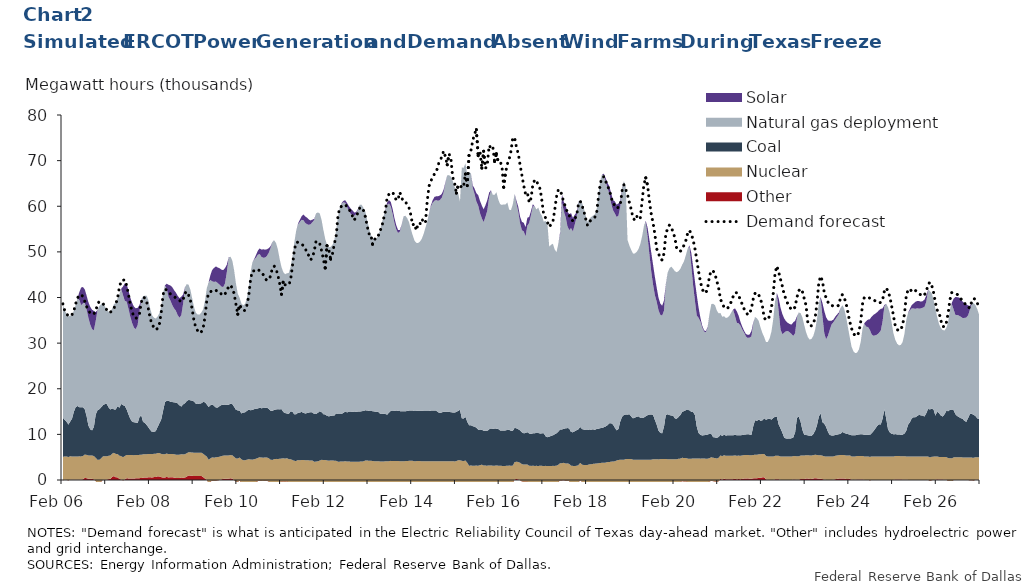
| Category | Demand forecast |
|---|---|
| 2021-02-06 | 38.603 |
| 2021-02-06 01:00:00 | 37.098 |
| 2021-02-06 01:59:59 | 36.406 |
| 2021-02-06 02:59:59 | 35.972 |
| 2021-02-06 03:59:59 | 35.879 |
| 2021-02-06 04:59:59 | 36.238 |
| 2021-02-06 05:59:59 | 37.058 |
| 2021-02-06 06:59:59 | 38.604 |
| 2021-02-06 07:59:59 | 39.868 |
| 2021-02-06 08:59:59 | 40.562 |
| 2021-02-06 09:59:59 | 40.577 |
| 2021-02-06 10:59:59 | 40.236 |
| 2021-02-06 11:59:59 | 39.157 |
| 2021-02-06 12:59:59 | 38.033 |
| 2021-02-06 13:59:59 | 37.12 |
| 2021-02-06 14:59:59 | 36.607 |
| 2021-02-06 15:59:59 | 36.265 |
| 2021-02-06 16:59:59 | 36.418 |
| 2021-02-06 17:59:59 | 36.966 |
| 2021-02-06 18:59:59 | 38.603 |
| 2021-02-06 19:59:59 | 39.125 |
| 2021-02-06 20:59:59 | 38.965 |
| 2021-02-06 21:59:59 | 38.671 |
| 2021-02-06 22:59:59 | 38.06 |
| 2021-02-06 23:59:59 | 37.316 |
| 2021-02-07 00:59:59 | 36.725 |
| 2021-02-07 01:59:59 | 36.808 |
| 2021-02-07 02:59:59 | 36.994 |
| 2021-02-07 03:59:59 | 37.567 |
| 2021-02-07 04:59:59 | 38.61 |
| 2021-02-07 05:59:59 | 39.798 |
| 2021-02-07 06:59:59 | 42.202 |
| 2021-02-07 07:59:59 | 43.675 |
| 2021-02-07 08:59:59 | 43.78 |
| 2021-02-07 09:59:59 | 43.868 |
| 2021-02-07 10:59:59 | 42.668 |
| 2021-02-07 11:59:59 | 40.676 |
| 2021-02-07 12:59:59 | 38.45 |
| 2021-02-07 13:59:59 | 36.906 |
| 2021-02-07 14:59:59 | 35.811 |
| 2021-02-07 15:59:59 | 35.426 |
| 2021-02-07 16:59:59 | 35.669 |
| 2021-02-07 17:59:59 | 36.302 |
| 2021-02-07 18:59:59 | 38.915 |
| 2021-02-07 19:59:59 | 40.088 |
| 2021-02-07 20:59:59 | 39.893 |
| 2021-02-07 21:59:59 | 39.015 |
| 2021-02-07 22:59:59 | 37.355 |
| 2021-02-07 23:59:59 | 35.226 |
| 2021-02-08 00:59:59 | 34.246 |
| 2021-02-08 01:59:59 | 33.296 |
| 2021-02-08 02:59:59 | 32.929 |
| 2021-02-08 03:59:59 | 33.219 |
| 2021-02-08 04:59:59 | 34.242 |
| 2021-02-08 05:59:59 | 36.758 |
| 2021-02-08 06:59:59 | 40.654 |
| 2021-02-08 07:59:59 | 41.841 |
| 2021-02-08 08:59:59 | 41.646 |
| 2021-02-08 09:59:59 | 41.359 |
| 2021-02-08 10:59:59 | 40.795 |
| 2021-02-08 11:59:59 | 40.624 |
| 2021-02-08 12:59:59 | 40.278 |
| 2021-02-08 13:59:59 | 39.857 |
| 2021-02-08 14:59:59 | 39.524 |
| 2021-02-08 15:59:59 | 39.342 |
| 2021-02-08 16:59:59 | 39.048 |
| 2021-02-08 17:59:59 | 39.533 |
| 2021-02-08 18:59:59 | 40.945 |
| 2021-02-08 19:59:59 | 41.309 |
| 2021-02-08 20:59:59 | 40.535 |
| 2021-02-08 21:59:59 | 39.327 |
| 2021-02-08 22:59:59 | 37.386 |
| 2021-02-08 23:59:59 | 34.805 |
| 2021-02-09 00:59:59 | 33.389 |
| 2021-02-09 01:59:59 | 32.707 |
| 2021-02-09 02:59:59 | 32.187 |
| 2021-02-09 03:59:59 | 32.464 |
| 2021-02-09 04:59:59 | 33.324 |
| 2021-02-09 05:59:59 | 35.757 |
| 2021-02-09 06:59:59 | 39.396 |
| 2021-02-09 07:59:59 | 40.957 |
| 2021-02-09 08:59:59 | 41.263 |
| 2021-02-09 09:59:59 | 41.497 |
| 2021-02-09 10:59:59 | 41.384 |
| 2021-02-09 11:59:59 | 41.592 |
| 2021-02-09 12:59:59 | 41.244 |
| 2021-02-09 13:59:59 | 41.213 |
| 2021-02-09 14:59:59 | 40.725 |
| 2021-02-09 15:59:59 | 41.131 |
| 2021-02-09 16:59:59 | 40.81 |
| 2021-02-09 17:59:59 | 41.366 |
| 2021-02-09 18:59:59 | 42.464 |
| 2021-02-09 19:59:59 | 42.71 |
| 2021-02-09 20:59:59 | 42.051 |
| 2021-02-09 21:59:59 | 40.849 |
| 2021-02-09 22:59:59 | 38.527 |
| 2021-02-09 23:59:59 | 36.346 |
| 2021-02-10 00:59:59 | 38.45 |
| 2021-02-10 01:59:59 | 37.625 |
| 2021-02-10 02:59:59 | 37.133 |
| 2021-02-10 04:00:00 | 37.165 |
| 2021-02-10 05:00:00 | 38.248 |
| 2021-02-10 06:00:00 | 40.311 |
| 2021-02-10 07:00:00 | 43.892 |
| 2021-02-10 07:59:59 | 45.817 |
| 2021-02-10 08:59:59 | 45.833 |
| 2021-02-10 09:59:59 | 46.128 |
| 2021-02-10 10:59:59 | 46.184 |
| 2021-02-10 11:59:59 | 45.853 |
| 2021-02-10 12:59:59 | 45.424 |
| 2021-02-10 13:59:59 | 45.005 |
| 2021-02-10 14:59:59 | 44.129 |
| 2021-02-10 15:59:59 | 43.757 |
| 2021-02-10 16:59:59 | 43.932 |
| 2021-02-10 17:59:59 | 44.703 |
| 2021-02-10 18:59:59 | 46.479 |
| 2021-02-10 19:59:59 | 46.879 |
| 2021-02-10 20:59:59 | 46.223 |
| 2021-02-10 21:59:59 | 44.92 |
| 2021-02-10 22:59:59 | 43.029 |
| 2021-02-10 23:59:59 | 40.713 |
| 2021-02-11 00:59:59 | 43.672 |
| 2021-02-11 01:59:59 | 42.783 |
| 2021-02-11 02:59:59 | 42.731 |
| 2021-02-11 03:59:59 | 42.745 |
| 2021-02-11 04:59:59 | 43.816 |
| 2021-02-11 05:59:59 | 46.855 |
| 2021-02-11 06:59:59 | 50.215 |
| 2021-02-11 07:59:59 | 52.038 |
| 2021-02-11 08:59:59 | 52.116 |
| 2021-02-11 09:59:59 | 51.917 |
| 2021-02-11 10:59:59 | 51.627 |
| 2021-02-11 11:59:59 | 51.421 |
| 2021-02-11 12:59:59 | 50.925 |
| 2021-02-11 13:59:59 | 49.542 |
| 2021-02-11 14:59:59 | 49.243 |
| 2021-02-11 15:59:59 | 48.256 |
| 2021-02-11 16:59:59 | 48.76 |
| 2021-02-11 17:59:59 | 50.23 |
| 2021-02-11 18:59:59 | 52.381 |
| 2021-02-11 19:59:59 | 52.111 |
| 2021-02-11 20:59:59 | 51.777 |
| 2021-02-11 21:59:59 | 50.307 |
| 2021-02-11 22:59:59 | 48.479 |
| 2021-02-11 23:59:59 | 46.472 |
| 2021-02-12 00:59:59 | 51.355 |
| 2021-02-12 01:59:59 | 50.433 |
| 2021-02-12 02:59:59 | 48.415 |
| 2021-02-12 03:59:59 | 49.612 |
| 2021-02-12 04:59:59 | 51.692 |
| 2021-02-12 05:59:59 | 53.404 |
| 2021-02-12 06:59:59 | 57.809 |
| 2021-02-12 07:59:59 | 59.736 |
| 2021-02-12 08:59:59 | 59.983 |
| 2021-02-12 09:59:59 | 60.101 |
| 2021-02-12 10:59:59 | 60.375 |
| 2021-02-12 11:59:59 | 59.888 |
| 2021-02-12 12:59:59 | 59.519 |
| 2021-02-12 13:59:59 | 58.607 |
| 2021-02-12 14:59:59 | 57.837 |
| 2021-02-12 15:59:59 | 56.924 |
| 2021-02-12 16:59:59 | 57.958 |
| 2021-02-12 17:59:59 | 58.52 |
| 2021-02-12 18:59:59 | 59.72 |
| 2021-02-12 19:59:59 | 59.688 |
| 2021-02-12 20:59:59 | 59.098 |
| 2021-02-12 21:59:59 | 57.764 |
| 2021-02-12 22:59:59 | 55.817 |
| 2021-02-12 23:59:59 | 53.951 |
| 2021-02-13 00:59:59 | 53.966 |
| 2021-02-13 01:59:59 | 51.704 |
| 2021-02-13 02:59:59 | 52.83 |
| 2021-02-13 03:59:59 | 52.772 |
| 2021-02-13 04:59:59 | 53.308 |
| 2021-02-13 05:59:59 | 54.625 |
| 2021-02-13 06:59:59 | 55.275 |
| 2021-02-13 07:59:59 | 57.183 |
| 2021-02-13 08:59:59 | 58.775 |
| 2021-02-13 09:59:59 | 61.933 |
| 2021-02-13 10:59:59 | 62.619 |
| 2021-02-13 11:59:59 | 63.01 |
| 2021-02-13 12:59:59 | 63.043 |
| 2021-02-13 13:59:59 | 62.408 |
| 2021-02-13 14:59:59 | 61.28 |
| 2021-02-13 15:59:59 | 61.567 |
| 2021-02-13 16:59:59 | 63.06 |
| 2021-02-13 17:59:59 | 61.745 |
| 2021-02-13 18:59:59 | 61.207 |
| 2021-02-13 19:59:59 | 61.143 |
| 2021-02-13 20:59:59 | 60.248 |
| 2021-02-13 21:59:59 | 59.706 |
| 2021-02-13 22:59:59 | 58.134 |
| 2021-02-13 23:59:59 | 55.882 |
| 2021-02-14 00:59:59 | 56.179 |
| 2021-02-14 01:59:59 | 54.689 |
| 2021-02-14 02:59:59 | 56.145 |
| 2021-02-14 03:59:59 | 56.032 |
| 2021-02-14 04:59:59 | 57.194 |
| 2021-02-14 05:59:59 | 56.63 |
| 2021-02-14 06:59:59 | 56.283 |
| 2021-02-14 07:59:59 | 61.088 |
| 2021-02-14 08:59:59 | 64.387 |
| 2021-02-14 10:00:00 | 65.501 |
| 2021-02-14 11:00:00 | 66.395 |
| 2021-02-14 12:00:00 | 67.082 |
| 2021-02-14 12:59:59 | 67.471 |
| 2021-02-14 14:00:00 | 69.088 |
| 2021-02-14 15:00:00 | 70.007 |
| 2021-02-14 16:00:00 | 70.795 |
| 2021-02-14 17:00:00 | 72.101 |
| 2021-02-14 18:00:00 | 70.872 |
| 2021-02-14 19:00:00 | 69.094 |
| 2021-02-14 20:00:00 | 71.491 |
| 2021-02-14 21:00:00 | 70.522 |
| 2021-02-14 22:00:00 | 66.375 |
| 2021-02-14 23:00:00 | 65.166 |
| 2021-02-15 | 62.892 |
| 2021-02-15 01:00:00 | 64.579 |
| 2021-02-15 02:00:00 | 64.731 |
| 2021-02-15 03:00:00 | 64.015 |
| 2021-02-15 04:00:00 | 64.45 |
| 2021-02-15 05:00:00 | 67.069 |
| 2021-02-15 06:00:00 | 64.516 |
| 2021-02-15 07:00:00 | 71.408 |
| 2021-02-15 08:00:00 | 72.183 |
| 2021-02-15 09:00:00 | 74.356 |
| 2021-02-15 10:00:00 | 75.857 |
| 2021-02-15 11:00:00 | 76.783 |
| 2021-02-15 12:00:00 | 71.092 |
| 2021-02-15 13:00:00 | 71.972 |
| 2021-02-15 14:00:00 | 68.364 |
| 2021-02-15 15:00:00 | 72.062 |
| 2021-02-15 16:00:00 | 68.281 |
| 2021-02-15 17:00:00 | 69.139 |
| 2021-02-15 18:00:00 | 73.309 |
| 2021-02-15 19:00:00 | 72.78 |
| 2021-02-15 20:00:00 | 73.149 |
| 2021-02-15 21:00:00 | 69.814 |
| 2021-02-15 22:00:00 | 71.515 |
| 2021-02-15 23:00:00 | 69.706 |
| 2021-02-16 | 69.759 |
| 2021-02-16 01:00:00 | 68.946 |
| 2021-02-16 02:00:00 | 64.179 |
| 2021-02-16 03:00:00 | 67.283 |
| 2021-02-16 04:00:00 | 69.263 |
| 2021-02-16 05:00:00 | 70.318 |
| 2021-02-16 06:00:00 | 72.111 |
| 2021-02-16 07:00:00 | 75.061 |
| 2021-02-16 08:00:00 | 74.994 |
| 2021-02-16 09:00:00 | 72.937 |
| 2021-02-16 10:00:00 | 71.521 |
| 2021-02-16 11:00:00 | 69.033 |
| 2021-02-16 12:00:00 | 66.806 |
| 2021-02-16 13:00:00 | 64.56 |
| 2021-02-16 14:00:00 | 62.636 |
| 2021-02-16 15:00:00 | 62.981 |
| 2021-02-16 16:00:00 | 60.778 |
| 2021-02-16 17:00:00 | 61.726 |
| 2021-02-16 18:00:00 | 64.736 |
| 2021-02-16 19:00:00 | 65.722 |
| 2021-02-16 20:00:00 | 65.754 |
| 2021-02-16 21:00:00 | 64.426 |
| 2021-02-16 22:00:00 | 63.834 |
| 2021-02-16 23:00:00 | 61.165 |
| 2021-02-17 | 57.985 |
| 2021-02-17 01:00:00 | 57.474 |
| 2021-02-17 02:00:00 | 56.535 |
| 2021-02-17 03:00:00 | 55.462 |
| 2021-02-17 04:00:00 | 56.034 |
| 2021-02-17 05:00:00 | 56.549 |
| 2021-02-17 06:00:00 | 59.162 |
| 2021-02-17 07:00:00 | 62.111 |
| 2021-02-17 08:00:00 | 63.603 |
| 2021-02-17 09:00:00 | 63.545 |
| 2021-02-17 10:00:00 | 62.403 |
| 2021-02-17 11:00:00 | 60.8 |
| 2021-02-17 12:00:00 | 59.86 |
| 2021-02-17 13:00:00 | 58.533 |
| 2021-02-17 14:00:00 | 57.908 |
| 2021-02-17 15:00:00 | 57.707 |
| 2021-02-17 16:00:00 | 56.626 |
| 2021-02-17 17:00:00 | 57.321 |
| 2021-02-17 18:00:00 | 57.875 |
| 2021-02-17 19:00:00 | 60.349 |
| 2021-02-17 20:00:00 | 61.131 |
| 2021-02-17 21:00:00 | 60.223 |
| 2021-02-17 22:00:00 | 58.924 |
| 2021-02-17 23:00:00 | 57.279 |
| 2021-02-18 | 55.798 |
| 2021-02-18 01:00:00 | 56.591 |
| 2021-02-18 02:00:00 | 56.97 |
| 2021-02-18 03:00:00 | 57.292 |
| 2021-02-18 04:00:00 | 57.549 |
| 2021-02-18 05:00:00 | 58.466 |
| 2021-02-18 06:00:00 | 61.974 |
| 2021-02-18 07:00:00 | 64.912 |
| 2021-02-18 08:00:00 | 66.327 |
| 2021-02-18 09:00:00 | 66.471 |
| 2021-02-18 10:00:00 | 65.485 |
| 2021-02-18 11:00:00 | 64.457 |
| 2021-02-18 12:00:00 | 63.585 |
| 2021-02-18 13:00:00 | 62.053 |
| 2021-02-18 14:00:00 | 60.557 |
| 2021-02-18 15:00:00 | 60.25 |
| 2021-02-18 16:00:00 | 59.555 |
| 2021-02-18 17:00:00 | 59.783 |
| 2021-02-18 18:00:00 | 60.335 |
| 2021-02-18 19:00:00 | 63.393 |
| 2021-02-18 20:00:00 | 64.703 |
| 2021-02-18 21:00:00 | 63.696 |
| 2021-02-18 22:00:00 | 62.502 |
| 2021-02-18 23:00:00 | 60.798 |
| 2021-02-19 | 59.303 |
| 2021-02-19 01:00:00 | 57.383 |
| 2021-02-19 02:00:00 | 56.968 |
| 2021-02-19 03:00:00 | 57.85 |
| 2021-02-19 04:00:00 | 57.092 |
| 2021-02-19 05:00:00 | 57.468 |
| 2021-02-19 06:00:00 | 61.188 |
| 2021-02-19 07:00:00 | 64.821 |
| 2021-02-19 08:00:00 | 66.218 |
| 2021-02-19 09:00:00 | 64.506 |
| 2021-02-19 10:00:00 | 61.18 |
| 2021-02-19 11:00:00 | 58.324 |
| 2021-02-19 12:00:00 | 56.345 |
| 2021-02-19 13:00:00 | 53.849 |
| 2021-02-19 14:00:00 | 50.668 |
| 2021-02-19 15:00:00 | 49.722 |
| 2021-02-19 16:00:00 | 48.437 |
| 2021-02-19 17:00:00 | 48.208 |
| 2021-02-19 18:00:00 | 49.666 |
| 2021-02-19 19:00:00 | 53.854 |
| 2021-02-19 20:00:00 | 55.136 |
| 2021-02-19 21:00:00 | 55.873 |
| 2021-02-19 22:00:00 | 55.539 |
| 2021-02-19 23:00:00 | 54.206 |
| 2021-02-20 | 53.103 |
| 2021-02-20 01:00:00 | 50.7 |
| 2021-02-20 02:00:00 | 50.32 |
| 2021-02-20 03:00:00 | 50.15 |
| 2021-02-20 04:00:00 | 50.555 |
| 2021-02-20 05:00:00 | 51.506 |
| 2021-02-20 06:00:00 | 52.507 |
| 2021-02-20 07:00:00 | 54.083 |
| 2021-02-20 08:00:00 | 54.714 |
| 2021-02-20 09:00:00 | 53.908 |
| 2021-02-20 10:00:00 | 52.655 |
| 2021-02-20 11:00:00 | 50.708 |
| 2021-02-20 12:00:00 | 48.234 |
| 2021-02-20 13:00:00 | 45.728 |
| 2021-02-20 14:00:00 | 43.468 |
| 2021-02-20 15:00:00 | 41.833 |
| 2021-02-20 16:00:00 | 41.084 |
| 2021-02-20 17:00:00 | 40.99 |
| 2021-02-20 18:00:00 | 42.152 |
| 2021-02-20 19:00:00 | 44.789 |
| 2021-02-20 20:00:00 | 45.899 |
| 2021-02-20 21:00:00 | 45.818 |
| 2021-02-20 22:00:00 | 45.084 |
| 2021-02-20 | 43.672 |
| 2021-02-21 | 42.092 |
| 2021-02-21 | 39.666 |
| 2021-02-21 | 38.69 |
| 2021-02-21 | 37.875 |
| 2021-02-21 | 37.527 |
| 2021-02-21 | 37.699 |
| 2021-02-21 | 38.131 |
| 2021-02-21 | 39.205 |
| 2021-02-21 | 40.24 |
| 2021-02-21 | 41.064 |
| 2021-02-21 | 41.036 |
| 2021-02-21 | 40.45 |
| 2021-02-21 | 39.384 |
| 2021-02-21 | 38.473 |
| 2021-02-21 | 37.491 |
| 2021-02-21 | 36.88 |
| 2021-02-21 | 36.192 |
| 2021-02-21 | 36.554 |
| 2021-02-21 | 37.531 |
| 2021-02-21 | 39.71 |
| 2021-02-21 | 40.89 |
| 2021-02-21 | 41.111 |
| 2021-02-21 | 40.601 |
| 2021-02-21 | 39.629 |
| 2021-02-22 | 38.291 |
| 2021-02-22 | 35.495 |
| 2021-02-22 | 35.129 |
| 2021-02-22 | 35.136 |
| 2021-02-22 | 35.968 |
| 2021-02-22 | 37.788 |
| 2021-02-22 | 40.925 |
| 2021-02-22 | 45.344 |
| 2021-02-22 | 46.903 |
| 2021-02-22 | 45.52 |
| 2021-02-22 | 43.938 |
| 2021-02-22 | 42.479 |
| 2021-02-22 | 40.684 |
| 2021-02-22 | 39.623 |
| 2021-02-22 | 38.574 |
| 2021-02-22 | 37.89 |
| 2021-02-22 | 37.344 |
| 2021-02-22 | 37.331 |
| 2021-02-22 | 37.945 |
| 2021-02-22 | 40.019 |
| 2021-02-22 | 41.499 |
| 2021-02-22 | 41.921 |
| 2021-02-22 | 41.306 |
| 2021-02-22 | 39.742 |
| 2021-02-23 | 38.259 |
| 2021-02-23 | 34.407 |
| 2021-02-23 | 33.858 |
| 2021-02-23 | 33.787 |
| 2021-02-23 | 34.262 |
| 2021-02-23 | 35.596 |
| 2021-02-23 | 38.759 |
| 2021-02-23 | 43.248 |
| 2021-02-23 | 44.667 |
| 2021-02-23 | 43.582 |
| 2021-02-23 | 41.068 |
| 2021-02-23 | 39.929 |
| 2021-02-23 | 39.011 |
| 2021-02-23 | 38.392 |
| 2021-02-23 | 38.289 |
| 2021-02-23 | 38.117 |
| 2021-02-23 | 38.02 |
| 2021-02-23 | 38.071 |
| 2021-02-23 | 38.304 |
| 2021-02-23 | 40.162 |
| 2021-02-23 | 40.641 |
| 2021-02-23 | 39.904 |
| 2021-02-23 | 38.684 |
| 2021-02-23 | 36.651 |
| 2021-02-24 | 34.688 |
| 2021-02-24 | 33.208 |
| 2021-02-24 | 32.147 |
| 2021-02-24 | 31.62 |
| 2021-02-24 | 31.566 |
| 2021-02-24 | 32.369 |
| 2021-02-24 | 34.706 |
| 2021-02-24 | 38.579 |
| 2021-02-24 | 40.036 |
| 2021-02-24 | 39.957 |
| 2021-02-24 | 39.823 |
| 2021-02-24 | 39.903 |
| 2021-02-24 | 39.714 |
| 2021-02-24 | 39.468 |
| 2021-02-24 | 39.252 |
| 2021-02-24 | 38.971 |
| 2021-02-24 | 38.815 |
| 2021-02-24 | 38.912 |
| 2021-02-24 | 39.379 |
| 2021-02-24 | 41.398 |
| 2021-02-24 | 42.081 |
| 2021-02-24 | 41.431 |
| 2021-02-24 | 40.133 |
| 2021-02-24 | 38.132 |
| 2021-02-25 | 35.982 |
| 2021-02-25 | 33.731 |
| 2021-02-25 | 32.963 |
| 2021-02-25 | 32.722 |
| 2021-02-25 | 32.93 |
| 2021-02-25 | 33.955 |
| 2021-02-25 | 36.288 |
| 2021-02-25 | 40.27 |
| 2021-02-25 | 41.768 |
| 2021-02-25 | 41.448 |
| 2021-02-25 | 41.644 |
| 2021-02-25 | 41.934 |
| 2021-02-25 | 41.541 |
| 2021-02-25 | 41.261 |
| 2021-02-25 | 40.839 |
| 2021-02-25 | 40.567 |
| 2021-02-25 | 40.28 |
| 2021-02-25 | 40.589 |
| 2021-02-25 | 41.278 |
| 2021-02-25 | 42.837 |
| 2021-02-25 | 43.348 |
| 2021-02-25 | 42.678 |
| 2021-02-25 | 41.128 |
| 2021-02-25 | 38.857 |
| 2021-02-26 | 37.242 |
| 2021-02-26 | 36.725 |
| 2021-02-26 | 34.986 |
| 2021-02-26 | 33.673 |
| 2021-02-26 | 33.565 |
| 2021-02-26 | 34.453 |
| 2021-02-26 | 36.489 |
| 2021-02-26 | 39.525 |
| 2021-02-26 | 41.08 |
| 2021-02-26 | 41.019 |
| 2021-02-26 | 40.898 |
| 2021-02-26 | 40.679 |
| 2021-02-26 | 40.308 |
| 2021-02-26 | 39.715 |
| 2021-02-26 | 39.223 |
| 2021-02-26 | 38.844 |
| 2021-02-26 | 38.048 |
| 2021-02-26 | 37.862 |
| 2021-02-26 | 37.712 |
| 2021-02-26 | 39.189 |
| 2021-02-26 | 39.781 |
| 2021-02-26 | 39.593 |
| 2021-02-26 | 38.745 |
| 2021-02-26 | 38.135 |